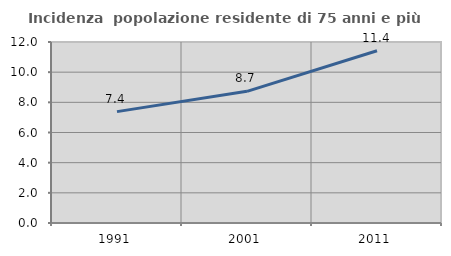
| Category | Incidenza  popolazione residente di 75 anni e più |
|---|---|
| 1991.0 | 7.384 |
| 2001.0 | 8.728 |
| 2011.0 | 11.417 |